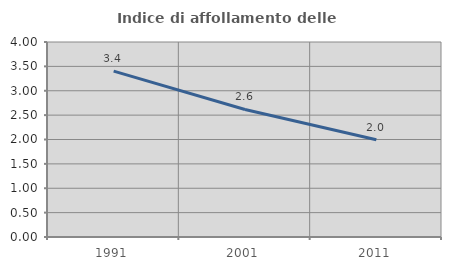
| Category | Indice di affollamento delle abitazioni  |
|---|---|
| 1991.0 | 3.402 |
| 2001.0 | 2.616 |
| 2011.0 | 1.996 |